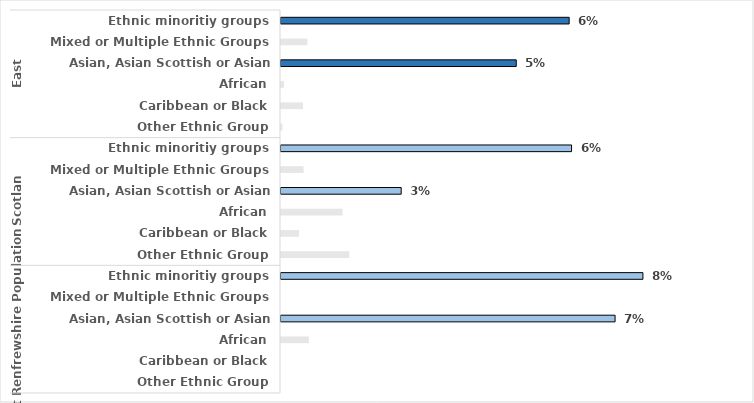
| Category | 2019/20 |
|---|---|
| 0 | 0.062 |
| 1 | 0.006 |
| 2 | 0.051 |
| 3 | 0.001 |
| 4 | 0.005 |
| 5 | 0 |
| 6 | 0.063 |
| 7 | 0.005 |
| 8 | 0.026 |
| 9 | 0.013 |
| 10 | 0.004 |
| 11 | 0.015 |
| 12 | 0.078 |
| 13 | 0 |
| 14 | 0.072 |
| 15 | 0.006 |
| 16 | 0 |
| 17 | 0 |